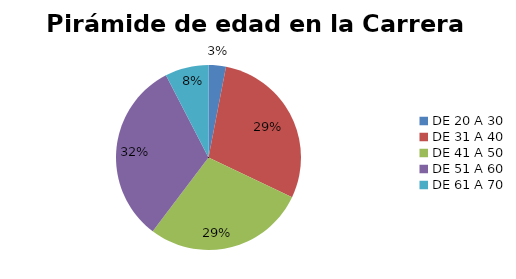
| Category | TOTAL |
|---|---|
| DE 20 A 30 | 75 |
| DE 31 A 40 | 717 |
| DE 41 A 50 | 698 |
| DE 51 A 60 | 793 |
| DE 61 A 70 | 188 |